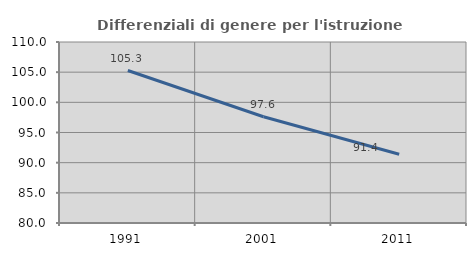
| Category | Differenziali di genere per l'istruzione superiore |
|---|---|
| 1991.0 | 105.273 |
| 2001.0 | 97.608 |
| 2011.0 | 91.395 |